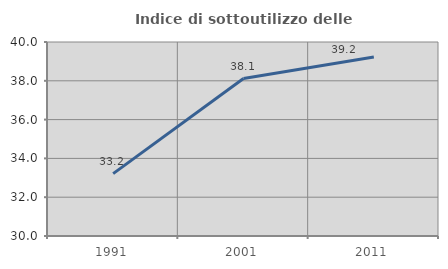
| Category | Indice di sottoutilizzo delle abitazioni  |
|---|---|
| 1991.0 | 33.216 |
| 2001.0 | 38.117 |
| 2011.0 | 39.228 |